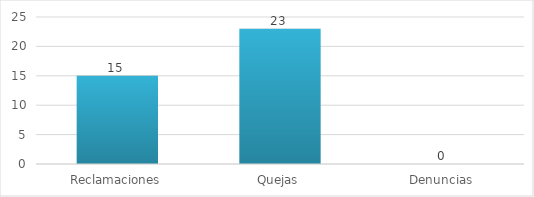
| Category | Series 0 |
|---|---|
| Reclamaciones | 15 |
| Quejas | 23 |
| Denuncias | 0 |